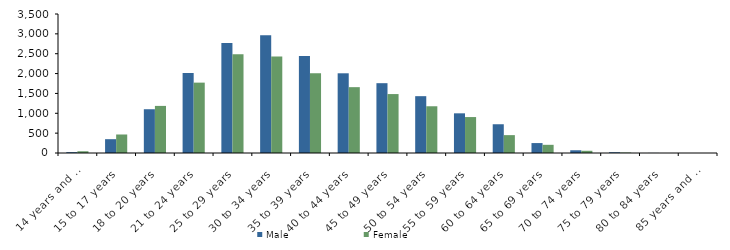
| Category | Male | Female |
|---|---|---|
| 14 years and under | 21 | 44 |
| 15 to 17 years | 348 | 466 |
| 18 to 20 years | 1102 | 1186 |
| 21 to 24 years | 2015 | 1772 |
| 25 to 29 years | 2771 | 2484 |
| 30 to 34 years | 2962 | 2427 |
| 35 to 39 years | 2444 | 2006 |
| 40 to 44 years | 2007 | 1658 |
| 45 to 49 years | 1758 | 1484 |
| 50 to 54 years | 1431 | 1177 |
| 55 to 59 years | 999 | 905 |
| 60 to 64 years | 724 | 450 |
| 65 to 69 years | 250 | 206 |
| 70 to 74 years | 69 | 56 |
| 75 to 79 years | 19 | 11 |
| 80 to 84 years | 2 | 0 |
| 85 years and over | 0 | 0 |